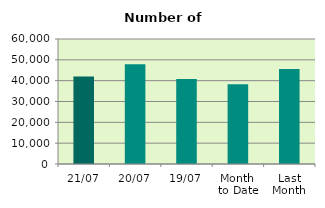
| Category | Series 0 |
|---|---|
| 21/07 | 42046 |
| 20/07 | 47844 |
| 19/07 | 40780 |
| Month 
to Date | 38306.533 |
| Last
Month | 45645.364 |